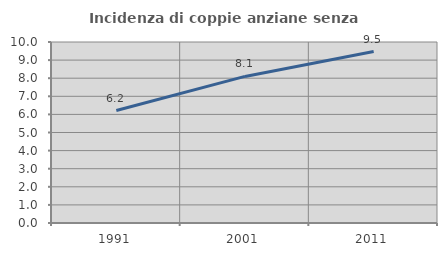
| Category | Incidenza di coppie anziane senza figli  |
|---|---|
| 1991.0 | 6.215 |
| 2001.0 | 8.098 |
| 2011.0 | 9.475 |